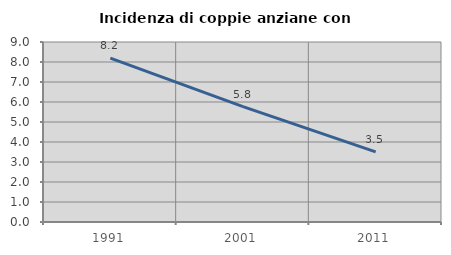
| Category | Incidenza di coppie anziane con figli |
|---|---|
| 1991.0 | 8.197 |
| 2001.0 | 5.769 |
| 2011.0 | 3.509 |